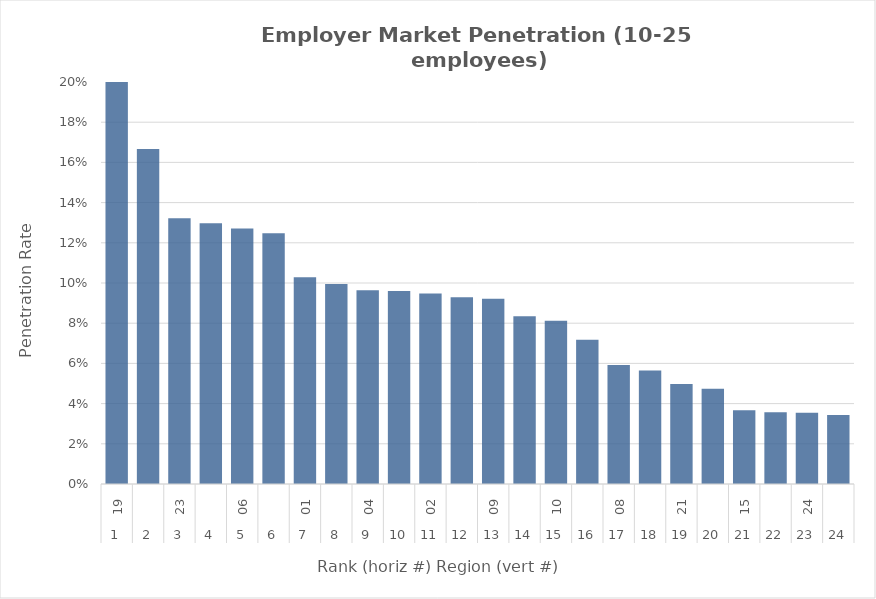
| Category | Rate |
|---|---|
| 0 | 0.201 |
| 1 | 0.167 |
| 2 | 0.132 |
| 3 | 0.13 |
| 4 | 0.127 |
| 5 | 0.125 |
| 6 | 0.103 |
| 7 | 0.099 |
| 8 | 0.096 |
| 9 | 0.096 |
| 10 | 0.095 |
| 11 | 0.093 |
| 12 | 0.092 |
| 13 | 0.083 |
| 14 | 0.081 |
| 15 | 0.072 |
| 16 | 0.059 |
| 17 | 0.056 |
| 18 | 0.05 |
| 19 | 0.047 |
| 20 | 0.037 |
| 21 | 0.036 |
| 22 | 0.035 |
| 23 | 0.034 |